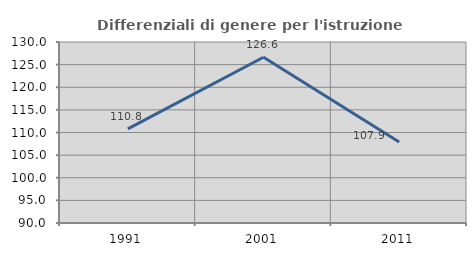
| Category | Differenziali di genere per l'istruzione superiore |
|---|---|
| 1991.0 | 110.792 |
| 2001.0 | 126.619 |
| 2011.0 | 107.898 |